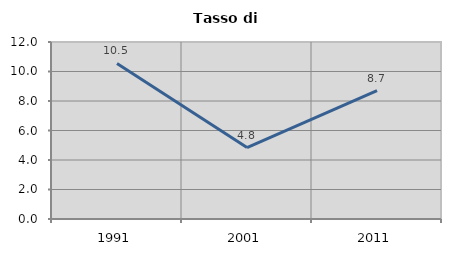
| Category | Tasso di disoccupazione   |
|---|---|
| 1991.0 | 10.547 |
| 2001.0 | 4.844 |
| 2011.0 | 8.711 |